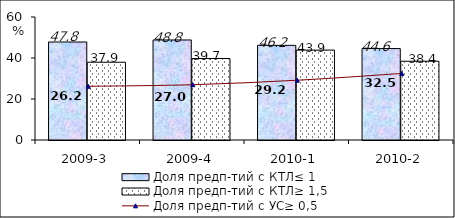
| Category | Доля предп-тий с КТЛ≤ 1 | Доля предп-тий с КТЛ≥ 1,5 |
|---|---|---|
| 2009-3 | 47.811 | 37.935 |
| 2009-4 | 48.803 | 39.749 |
| 2010-1 | 46.171 | 43.856 |
| 2010-2 | 44.607 | 38.427 |